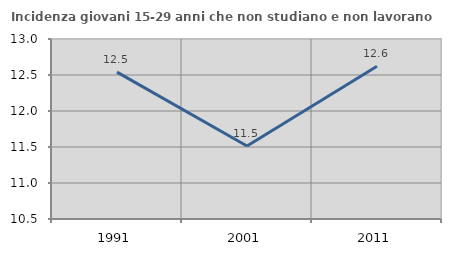
| Category | Incidenza giovani 15-29 anni che non studiano e non lavorano  |
|---|---|
| 1991.0 | 12.54 |
| 2001.0 | 11.514 |
| 2011.0 | 12.621 |